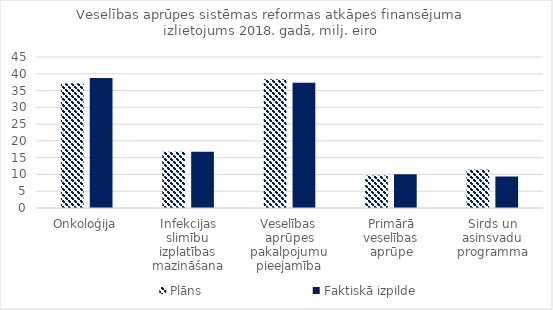
| Category | Plāns | Faktiskā izpilde |
|---|---|---|
| Onkoloģija | 37163269 | 38756386 |
| Infekcijas slimību izplatības mazināšana | 16740741 | 16740741 |
| Veselības aprūpes pakalpojumu pieejamība | 38373824 | 37353637 |
| Primārā veselības aprūpe | 9664036 | 10058853 |
| Sirds un asinsvadu programma | 11458130 | 9382962 |